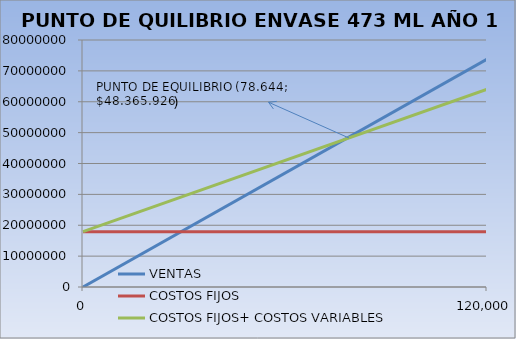
| Category | VENTAS | COSTOS FIJOS | COSTOS FIJOS+ COSTOS VARIABLES |
|---|---|---|---|
| 0.0 | 0 | 17931133.332 | 17931133.332 |
| 120000.0 | 73800000 | 17931133.332 | 64042805.213 |